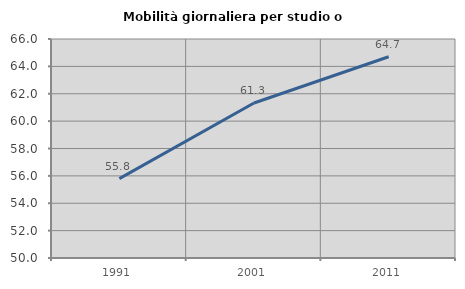
| Category | Mobilità giornaliera per studio o lavoro |
|---|---|
| 1991.0 | 55.795 |
| 2001.0 | 61.326 |
| 2011.0 | 64.706 |